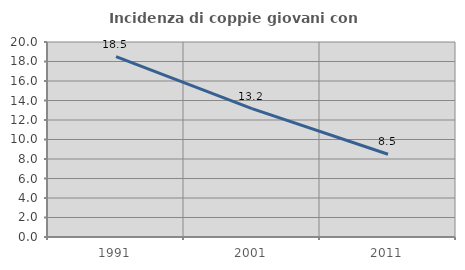
| Category | Incidenza di coppie giovani con figli |
|---|---|
| 1991.0 | 18.497 |
| 2001.0 | 13.165 |
| 2011.0 | 8.485 |